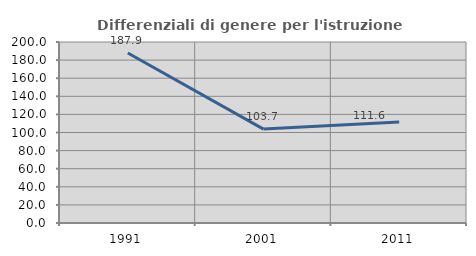
| Category | Differenziali di genere per l'istruzione superiore |
|---|---|
| 1991.0 | 187.868 |
| 2001.0 | 103.745 |
| 2011.0 | 111.6 |